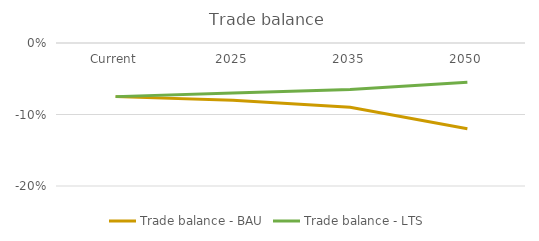
| Category | Trade balance - BAU | Trade balance - LTS |
|---|---|---|
| Current | -0.075 | -0.075 |
| 2025 | -0.08 | -0.07 |
| 2035 | -0.09 | -0.065 |
| 2050 | -0.12 | -0.055 |